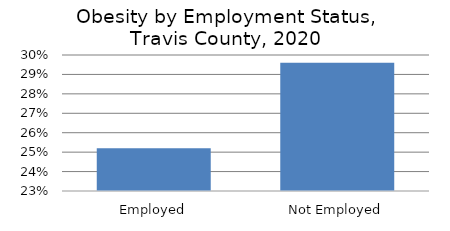
| Category | Series 0 |
|---|---|
| Employed | 0.252 |
| Not Employed | 0.296 |